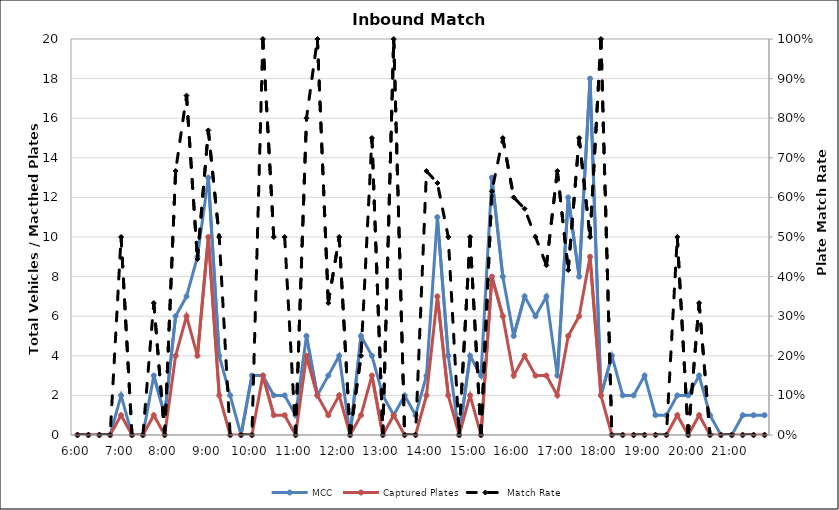
| Category | MCC | Captured Plates |
|---|---|---|
| 0.25 | 0 | 0 |
| 0.260416666666667 | 0 | 0 |
| 0.270833333333333 | 0 | 0 |
| 0.28125 | 0 | 0 |
| 0.291666666666667 | 2 | 1 |
| 0.302083333333333 | 0 | 0 |
| 0.3125 | 0 | 0 |
| 0.322916666666667 | 3 | 1 |
| 0.333333333333333 | 1 | 0 |
| 0.34375 | 6 | 4 |
| 0.354166666666667 | 7 | 6 |
| 0.364583333333333 | 9 | 4 |
| 0.375 | 13 | 10 |
| 0.385416666666667 | 4 | 2 |
| 0.395833333333333 | 2 | 0 |
| 0.40625 | 0 | 0 |
| 0.416666666666667 | 3 | 0 |
| 0.427083333333333 | 3 | 3 |
| 0.4375 | 2 | 1 |
| 0.447916666666667 | 2 | 1 |
| 0.458333333333333 | 1 | 0 |
| 0.46875 | 5 | 4 |
| 0.479166666666667 | 2 | 2 |
| 0.489583333333333 | 3 | 1 |
| 0.5 | 4 | 2 |
| 0.510416666666667 | 0 | 0 |
| 0.520833333333333 | 5 | 1 |
| 0.53125 | 4 | 3 |
| 0.541666666666667 | 2 | 0 |
| 0.552083333333333 | 1 | 1 |
| 0.5625 | 2 | 0 |
| 0.572916666666667 | 1 | 0 |
| 0.583333333333333 | 3 | 2 |
| 0.59375 | 11 | 7 |
| 0.604166666666667 | 4 | 2 |
| 0.614583333333333 | 0 | 0 |
| 0.625 | 4 | 2 |
| 0.635416666666667 | 3 | 0 |
| 0.645833333333333 | 13 | 8 |
| 0.65625 | 8 | 6 |
| 0.666666666666667 | 5 | 3 |
| 0.677083333333333 | 7 | 4 |
| 0.6875 | 6 | 3 |
| 0.697916666666667 | 7 | 3 |
| 0.708333333333333 | 3 | 2 |
| 0.71875 | 12 | 5 |
| 0.729166666666667 | 8 | 6 |
| 0.739583333333333 | 18 | 9 |
| 0.75 | 2 | 2 |
| 0.760416666666667 | 4 | 0 |
| 0.770833333333333 | 2 | 0 |
| 0.78125 | 2 | 0 |
| 0.791666666666667 | 3 | 0 |
| 0.802083333333333 | 1 | 0 |
| 0.8125 | 1 | 0 |
| 0.822916666666667 | 2 | 1 |
| 0.833333333333333 | 2 | 0 |
| 0.84375 | 3 | 1 |
| 0.854166666666667 | 1 | 0 |
| 0.864583333333333 | 0 | 0 |
| 0.875 | 0 | 0 |
| 0.885416666666667 | 1 | 0 |
| 0.895833333333333 | 1 | 0 |
| 0.90625 | 1 | 0 |